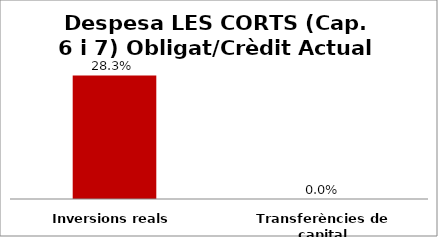
| Category | Series 0 |
|---|---|
| Inversions reals | 0.283 |
| Transferències de capital | 0 |